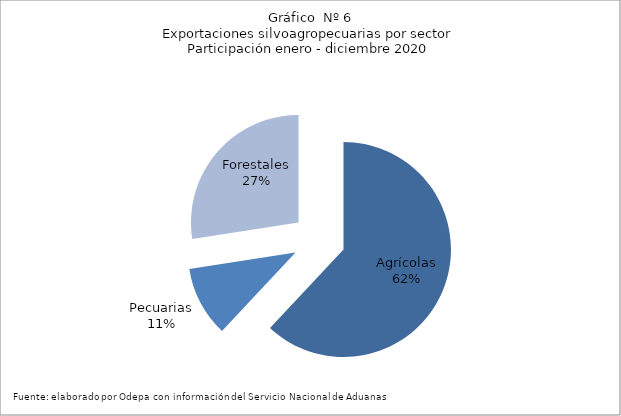
| Category | Series 0 |
|---|---|
| Agrícolas | 9728152 |
| Pecuarias | 1659733 |
| Forestales | 4308557 |